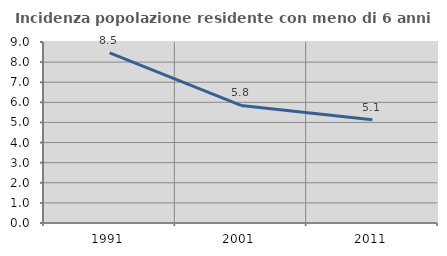
| Category | Incidenza popolazione residente con meno di 6 anni |
|---|---|
| 1991.0 | 8.459 |
| 2001.0 | 5.847 |
| 2011.0 | 5.14 |